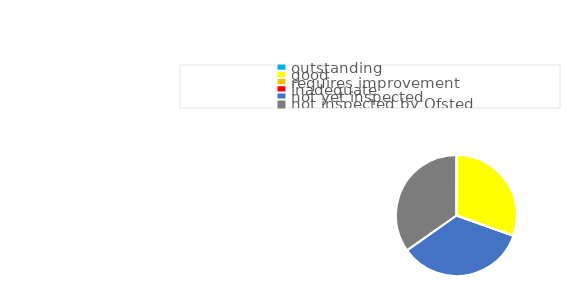
| Category | Series 0 |
|---|---|
| outstanding | 0 |
| good | 70000 |
| requires improvement | 0 |
| inadequate | 0 |
| not yet inspected | 80000 |
| not inspected by Ofsted | 80000 |